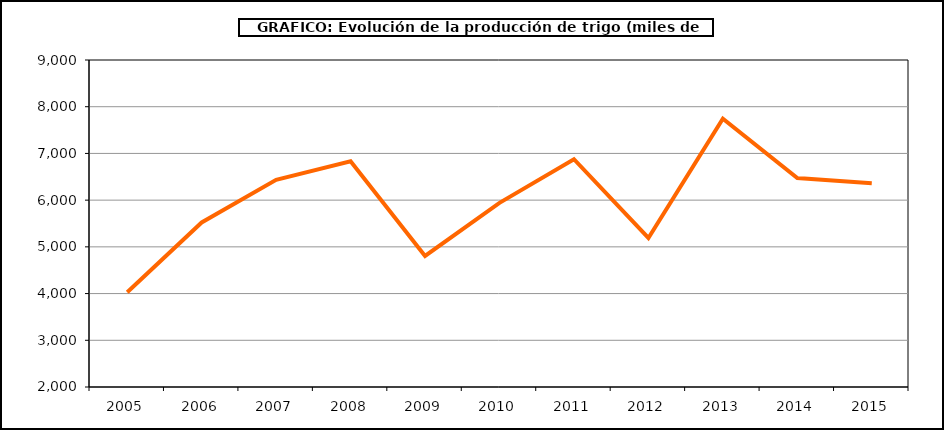
| Category | Producción |
|---|---|
| 2005.0 | 4026.694 |
| 2006.0 | 5521.582 |
| 2007.0 | 6436.359 |
| 2008.0 | 6831.461 |
| 2009.0 | 4804.772 |
| 2010.0 | 5941.197 |
| 2011.0 | 6876.651 |
| 2012.0 | 5189.828 |
| 2013.0 | 7744.928 |
| 2014.0 | 6472.734 |
| 2015.0 | 6362.692 |